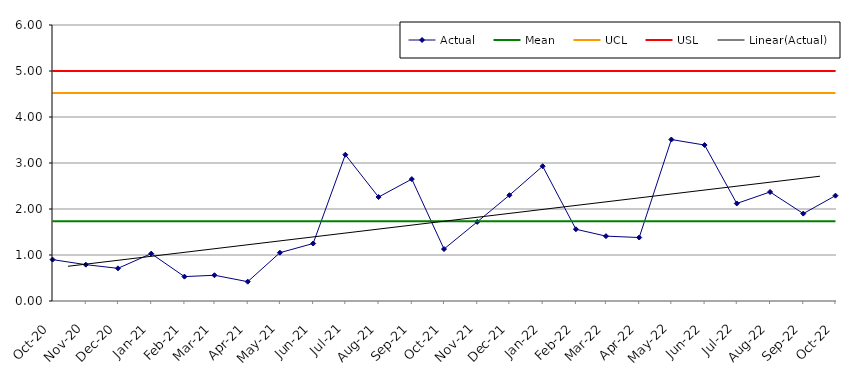
| Category | Actual | Mean | UCL | USL |
|---|---|---|---|---|
| 2020-10-01 | 0.9 | 1.734 | 4.524 | 5 |
| 2020-11-01 | 0.79 | 1.734 | 4.524 | 5 |
| 2020-12-01 | 0.71 | 1.734 | 4.524 | 5 |
| 2021-01-01 | 1.03 | 1.734 | 4.524 | 5 |
| 2021-02-01 | 0.53 | 1.734 | 4.524 | 5 |
| 2021-03-01 | 0.56 | 1.734 | 4.524 | 5 |
| 2021-04-01 | 0.42 | 1.734 | 4.524 | 5 |
| 2021-05-01 | 1.05 | 1.734 | 4.524 | 5 |
| 2021-06-01 | 1.25 | 1.734 | 4.524 | 5 |
| 2021-07-01 | 3.18 | 1.734 | 4.524 | 5 |
| 2021-08-01 | 2.26 | 1.734 | 4.524 | 5 |
| 2021-09-01 | 2.65 | 1.734 | 4.524 | 5 |
| 2021-10-01 | 1.13 | 1.734 | 4.524 | 5 |
| 2021-11-01 | 1.72 | 1.734 | 4.524 | 5 |
| 2021-12-01 | 2.3 | 1.734 | 4.524 | 5 |
| 2022-01-01 | 2.93 | 1.734 | 4.524 | 5 |
| 2022-02-01 | 1.56 | 1.734 | 4.524 | 5 |
| 2022-03-01 | 1.41 | 1.734 | 4.524 | 5 |
| 2022-04-01 | 1.38 | 1.734 | 4.524 | 5 |
| 2022-05-01 | 3.51 | 1.734 | 4.524 | 5 |
| 2022-06-01 | 3.39 | 1.734 | 4.524 | 5 |
| 2022-07-01 | 2.12 | 1.734 | 4.524 | 5 |
| 2022-08-01 | 2.37 | 1.734 | 4.524 | 5 |
| 2022-09-01 | 1.9 | 1.734 | 4.524 | 5 |
| 2022-10-01 | 2.29 | 1.734 | 4.524 | 5 |